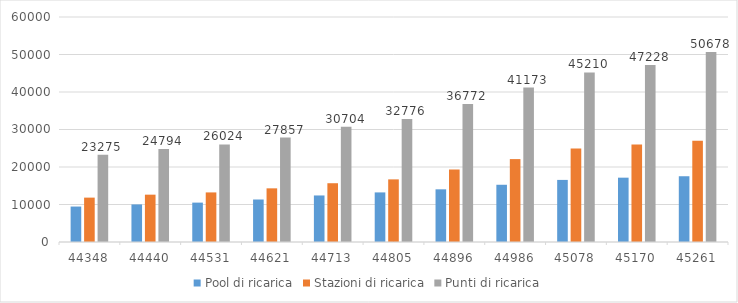
| Category | Pool di ricarica | Stazioni di ricarica | Punti di ricarica |
|---|---|---|---|
| 44348.0 | 9453 | 11834 | 23275 |
| 44440.0 | 10019 | 12622.5 | 24794 |
| 44531.0 | 10503 | 13223 | 26024 |
| 44621.0 | 11333 | 14311 | 27857 |
| 44713.0 | 12410 | 15674 | 30704 |
| 44805.0 | 13225 | 16700 | 32776 |
| 44896.0 | 14048 | 19334 | 36772 |
| 44986.0 | 15262 | 22107 | 41173 |
| 45078.0 | 16557 | 24942 | 45210 |
| 45170.0 | 17154 | 26029 | 47228 |
| 45261.0 | 17537 | 26997 | 50678 |